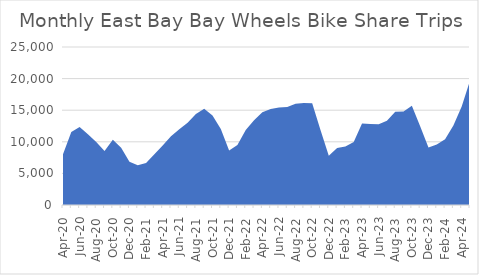
| Category | East Bay |
|---|---|
| 2020-04-01 | 8049 |
| 2020-05-01 | 11558 |
| 2020-06-01 | 12340 |
| 2020-07-01 | 11202 |
| 2020-08-01 | 9951 |
| 2020-09-01 | 8528 |
| 2020-10-01 | 10320 |
| 2020-11-01 | 9060 |
| 2020-12-01 | 6858 |
| 2021-01-01 | 6299 |
| 2021-02-01 | 6656 |
| 2021-03-01 | 8049 |
| 2021-04-01 | 9406 |
| 2021-05-01 | 10877 |
| 2021-06-01 | 11966 |
| 2021-07-01 | 12999 |
| 2021-08-01 | 14390 |
| 2021-09-01 | 15238 |
| 2021-10-01 | 14180 |
| 2021-11-01 | 12012 |
| 2021-12-01 | 8629 |
| 2022-01-01 | 9477 |
| 2022-02-01 | 11855 |
| 2022-03-01 | 13429 |
| 2022-04-01 | 14681 |
| 2022-05-01 | 15202 |
| 2022-06-01 | 15417 |
| 2022-07-01 | 15492 |
| 2022-08-01 | 16002 |
| 2022-09-01 | 16142 |
| 2022-10-01 | 16094 |
| 2022-11-01 | 11861 |
| 2022-12-01 | 7805 |
| 2023-01-01 | 9011 |
| 2023-02-01 | 9244 |
| 2023-03-01 | 9959 |
| 2023-04-01 | 12892 |
| 2023-05-01 | 12802 |
| 2023-06-01 | 12793 |
| 2023-07-01 | 13350 |
| 2023-08-01 | 14743 |
| 2023-09-01 | 14781 |
| 2023-10-01 | 15702 |
| 2023-11-01 | 12453 |
| 2023-12-01 | 9083 |
| 2024-01-01 | 9567 |
| 2024-02-01 | 10414 |
| 2024-03-01 | 12589 |
| 2024-04-01 | 15588 |
| 2024-05-01 | 19658 |